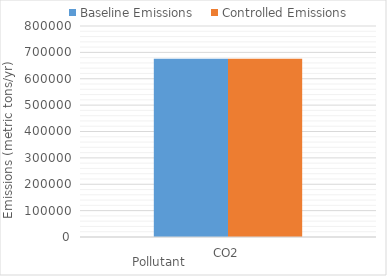
| Category | Baseline Emissions | Controlled Emissions |
|---|---|---|
| CO2 | 675368.767 | 675368.767 |